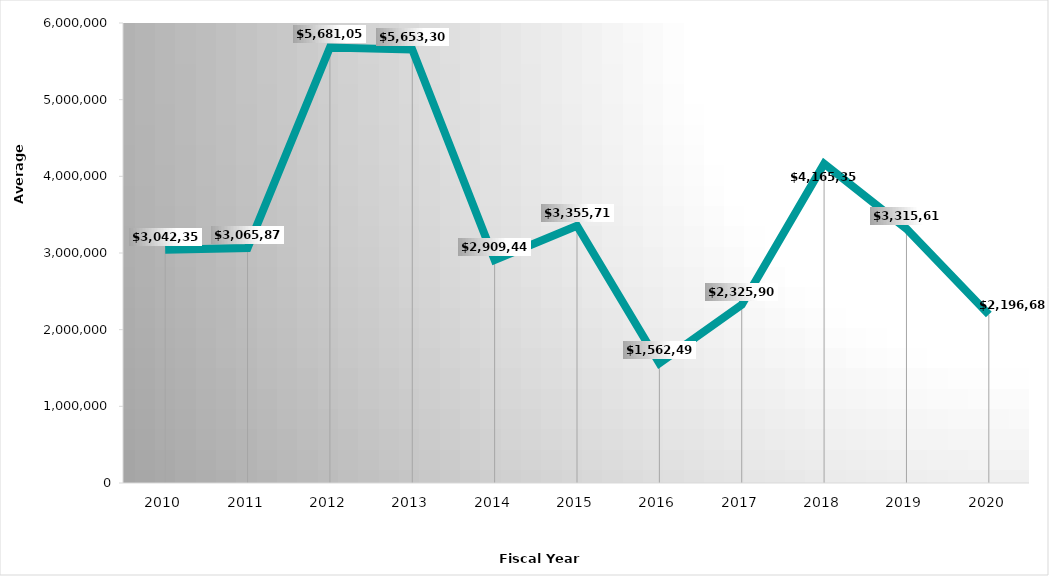
| Category | Mean |
|---|---|
| 2010.0 | 3042359 |
| 2011.0 | 3065870 |
| 2012.0 | 5681055 |
| 2013.0 | 5653306 |
| 2014.0 | 2909446 |
| 2015.0 | 3355712 |
| 2016.0 | 1562498 |
| 2017.0 | 2325909 |
| 2018.0 | 4165355 |
| 2019.0 | 3315610 |
| 2020.0 | 2196681 |